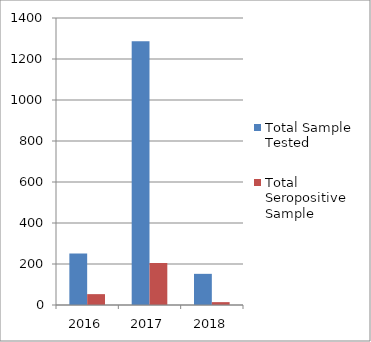
| Category | Total Sample Tested | Total Seropositive Sample |
|---|---|---|
| 2016.0 | 251 | 53 |
| 2017.0 | 1286 | 205 |
| 2018.0 | 152 | 14 |